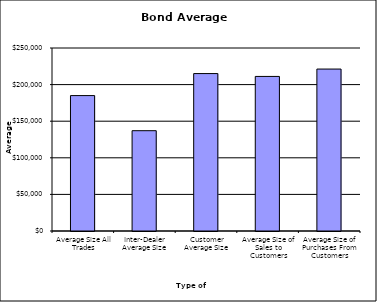
| Category | Security Type |
|---|---|
| Average Size All Trades | 184991.689 |
| Inter-Dealer Average Size | 137033.18 |
| Customer Average Size | 215059.119 |
| Average Size of Sales to Customers | 211166.828 |
| Average Size of Purchases From Customers | 221234.801 |